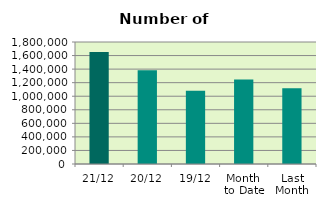
| Category | Series 0 |
|---|---|
| 21/12 | 1654170 |
| 20/12 | 1384770 |
| 19/12 | 1080606 |
| Month 
to Date | 1245233.067 |
| Last
Month | 1117514.364 |